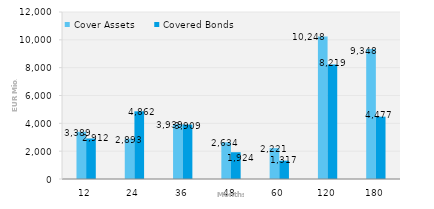
| Category | Cover Assets | Covered Bonds |
|---|---|---|
| 12.0 | 3388.7 | 2912 |
| 24.0 | 2892.5 | 4862.3 |
| 36.0 | 3939.4 | 3909.1 |
| 48.0 | 2634.4 | 1923.7 |
| 60.0 | 2220.6 | 1316.7 |
| 120.0 | 10247.5 | 8219.3 |
| 180.0 | 9347.6 | 4477.2 |